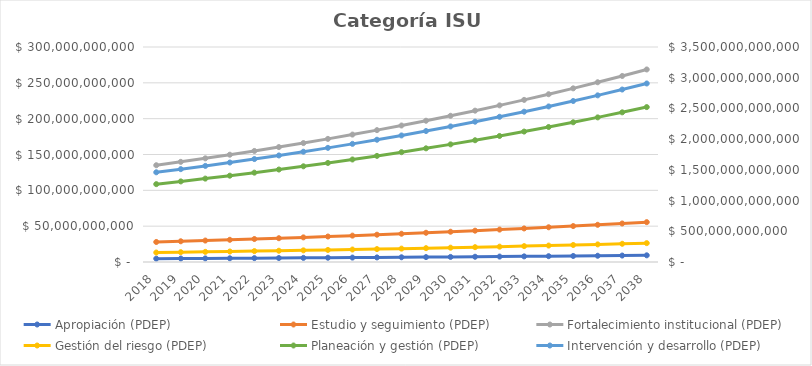
| Category | Apropiación (PDEP) | Estudio y seguimiento (PDEP) | Fortalecimiento institucional (PDEP) | Gestión del riesgo (PDEP) | Planeación y gestión (PDEP) |
|---|---|---|---|---|---|
| 2018.0 | 4686700704.581 | 27943112437.209 | 135017543314.276 | 13224750576.016 | 108630660522.007 |
| 2019.0 | 4850735229.241 | 28921121372.511 | 139743157330.276 | 13687616846.177 | 112432733640.277 |
| 2020.0 | 5020510962.265 | 29933360620.549 | 144634167836.835 | 14166683435.793 | 116367879317.687 |
| 2021.0 | 5196228845.944 | 30981028242.268 | 149696363711.125 | 14662517356.046 | 120440755093.806 |
| 2022.0 | 5378096855.552 | 32065364230.747 | 154935736441.014 | 15175705463.507 | 124656181522.089 |
| 2023.0 | 5566330245.496 | 33187651978.824 | 160358487216.449 | 15706855154.73 | 129019147875.362 |
| 2024.0 | 5761151804.089 | 34349219798.082 | 165971034269.025 | 16256595085.146 | 133534818051 |
| 2025.0 | 5962792117.232 | 35551442491.015 | 171780020468.441 | 16825575913.126 | 138208536682.785 |
| 2026.0 | 6171489841.335 | 36795742978.201 | 177792321184.836 | 17414471070.085 | 143045835466.682 |
| 2027.0 | 6387491985.782 | 38083593982.438 | 184015052426.306 | 18023977557.538 | 148052439708.016 |
| 2028.0 | 6611054205.284 | 39416519771.823 | 190455579261.226 | 18654816772.052 | 153234275097.797 |
| 2029.0 | 6842441102.469 | 40796097963.837 | 197121524535.369 | 19307735359.074 | 158597474726.22 |
| 2030.0 | 7081926541.055 | 42223961392.571 | 204020777894.107 | 19983506096.641 | 164148386341.637 |
| 2031.0 | 7329793969.992 | 43701800041.311 | 211161505120.401 | 20682928810.024 | 169893579863.595 |
| 2032.0 | 7586336758.942 | 45231363042.757 | 218552157799.615 | 21406831318.375 | 175839855158.82 |
| 2033.0 | 7851858545.505 | 46814460749.254 | 226201483322.602 | 22156070414.518 | 181994250089.379 |
| 2034.0 | 8126673594.598 | 48452966875.477 | 234118535238.893 | 22931532879.026 | 188364048842.507 |
| 2035.0 | 8411107170.408 | 50148820716.119 | 242312683972.254 | 23734136529.792 | 194956790551.995 |
| 2036.0 | 8705495921.373 | 51904029441.183 | 250793627911.283 | 24564831308.335 | 201780278221.315 |
| 2037.0 | 9010188278.621 | 53720670471.625 | 259571404888.178 | 25424600404.126 | 208842587959.061 |
| 2038.0 | 9325544868.372 | 55600893938.132 | 268656404059.264 | 26314461418.271 | 216152078537.628 |